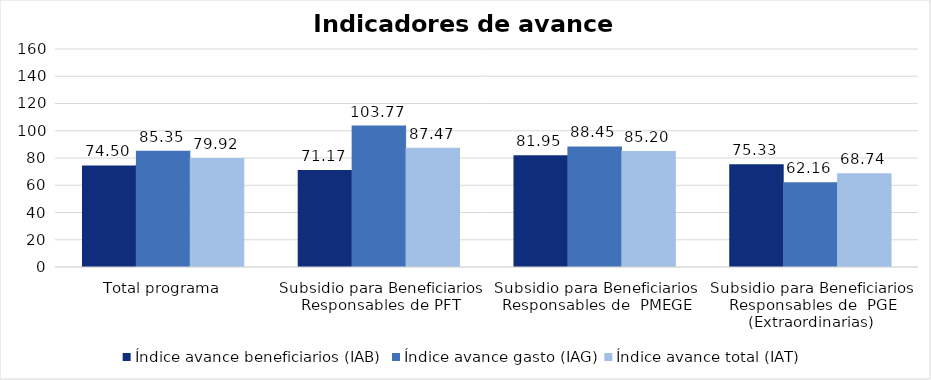
| Category | Índice avance beneficiarios (IAB)  | Índice avance gasto (IAG) | Índice avance total (IAT)  |
|---|---|---|---|
| Total programa | 74.503 | 85.346 | 79.924 |
| Subsidio para Beneficiarios Responsables de PFT | 71.172 | 103.769 | 87.471 |
| Subsidio para Beneficiarios Responsables de  PMEGE | 81.953 | 88.452 | 85.202 |
| Subsidio para Beneficiarios Responsables de  PGE (Extraordinarias) | 75.332 | 62.157 | 68.744 |